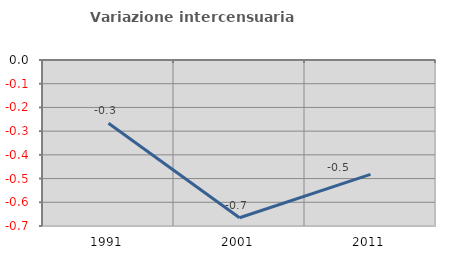
| Category | Variazione intercensuaria annua |
|---|---|
| 1991.0 | -0.266 |
| 2001.0 | -0.665 |
| 2011.0 | -0.482 |